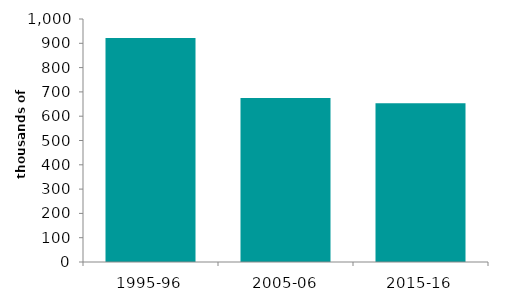
| Category | first time buyers |
|---|---|
| 1995-96 | 921.867 |
| 2005-06 | 675.044 |
| 2015-16 | 653.606 |